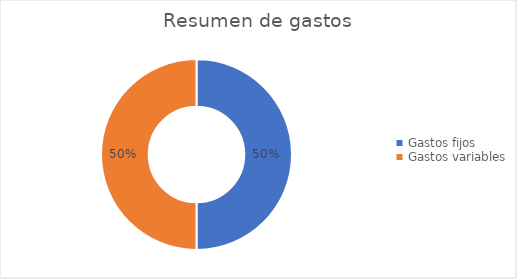
| Category | Series 0 |
|---|---|
| Gastos fijos | 20 |
| Gastos variables | 20 |